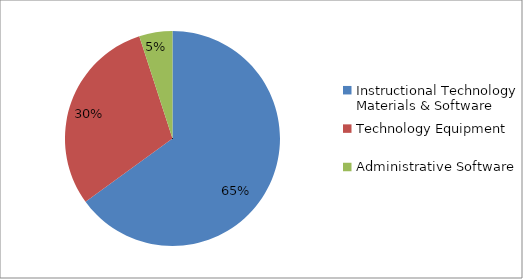
| Category | Series 0 |
|---|---|
| Instructional Technology Materials & Software | 0.65 |
| Technology Equipment | 0.3 |
| Administrative Software  | 0.05 |